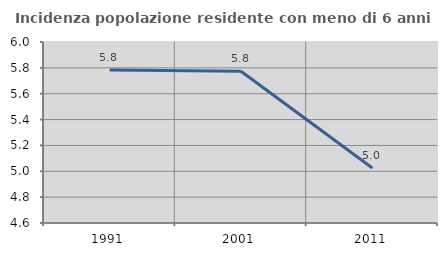
| Category | Incidenza popolazione residente con meno di 6 anni |
|---|---|
| 1991.0 | 5.783 |
| 2001.0 | 5.774 |
| 2011.0 | 5.025 |